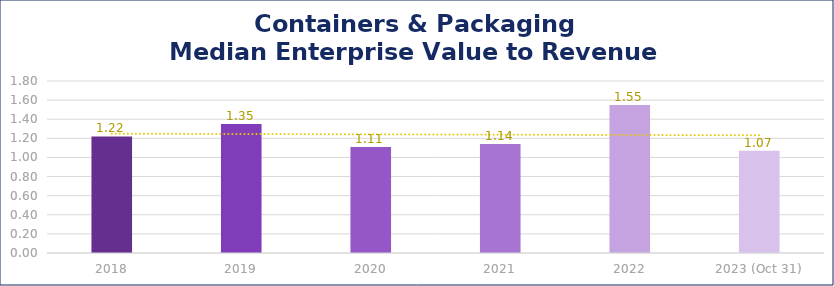
| Category | Containers & Packaging |
|---|---|
| 2018 | 1.22 |
| 2019 | 1.35 |
| 2020 | 1.11 |
| 2021 | 1.14 |
| 2022 | 1.55 |
| 2023 (Oct 31) | 1.07 |